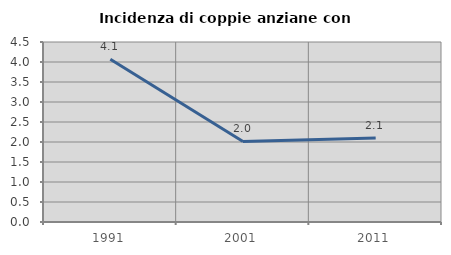
| Category | Incidenza di coppie anziane con figli |
|---|---|
| 1991.0 | 4.07 |
| 2001.0 | 2.013 |
| 2011.0 | 2.098 |